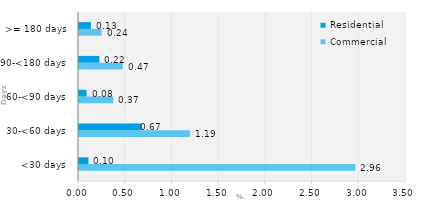
| Category | Commercial | Residential |
|---|---|---|
| <30 days | 2.959 | 0.101 |
| 30-<60 days | 1.189 | 0.67 |
| 60-<90 days | 0.367 | 0.081 |
| 90-<180 days | 0.469 | 0.218 |
| >= 180 days | 0.242 | 0.128 |